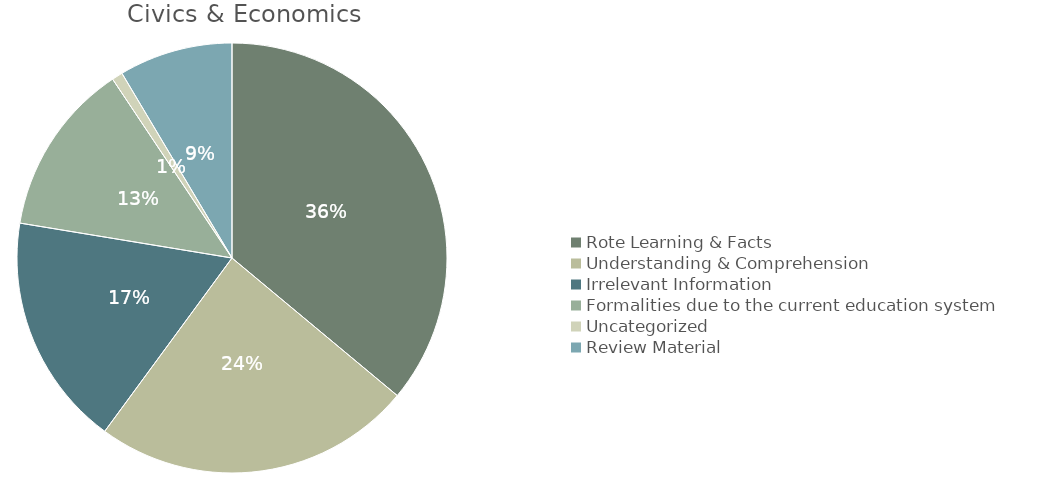
| Category | Civics |
|---|---|
| Rote Learning & Facts | 17.7 |
| Understanding & Comprehension | 11.8 |
| Irrelevant Information  | 8.6 |
| Formalities due to the current education system | 6.4 |
| Uncategorized | 0.4 |
| Review Material | 4.2 |